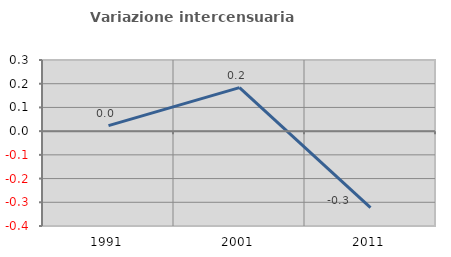
| Category | Variazione intercensuaria annua |
|---|---|
| 1991.0 | 0.023 |
| 2001.0 | 0.183 |
| 2011.0 | -0.322 |